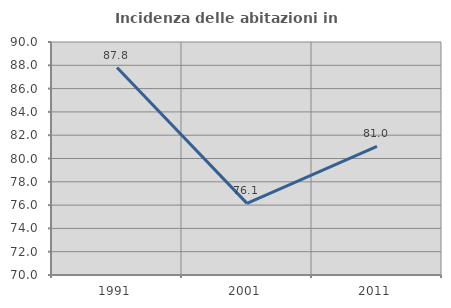
| Category | Incidenza delle abitazioni in proprietà  |
|---|---|
| 1991.0 | 87.805 |
| 2001.0 | 76.147 |
| 2011.0 | 81.034 |